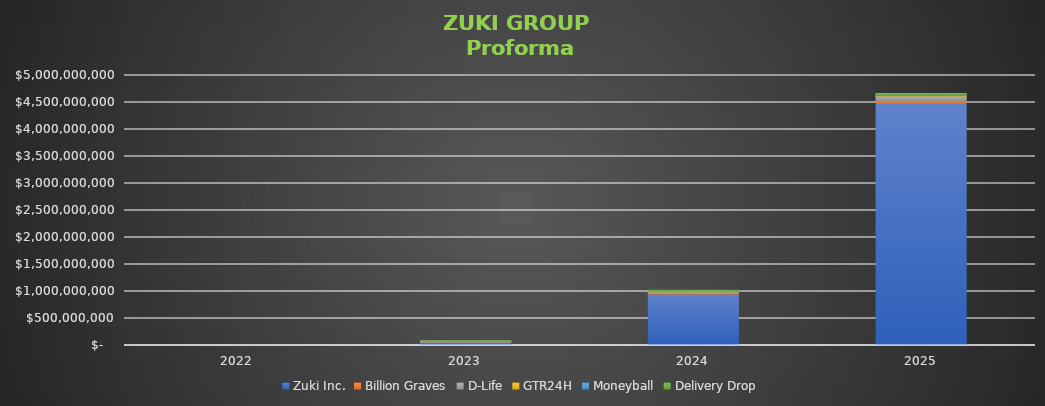
| Category | Zuki Inc. | Billion Graves | D-Life | GTR24H | Moneyball | Delivery Drop |
|---|---|---|---|---|---|---|
| 2022 | 11700 | 489821 | 0 | 36000 | 421800 | 242440 |
| 2023 | 66602518.43 | 2528212 | 4824000 | 6135000 | 11388600 | 2411062.32 |
| 2024 | 953157429.274 | 10849128 | 25920000 | 7327000 | 15944040 | 11037865.16 |
| 2025 | 4497588071.639 | 22864108 | 97200000 | 8166000 | 22777200 | 16004904.482 |